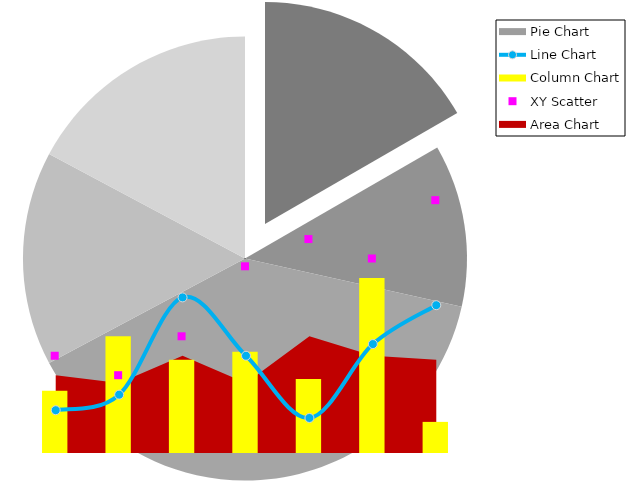
| Category | Column Chart |
|---|---|
| Sun | 16 |
| Mon | 30 |
| Tue | 24 |
| Wed | 26 |
| Thu | 19 |
| Fri | 45 |
| Sat | 8 |